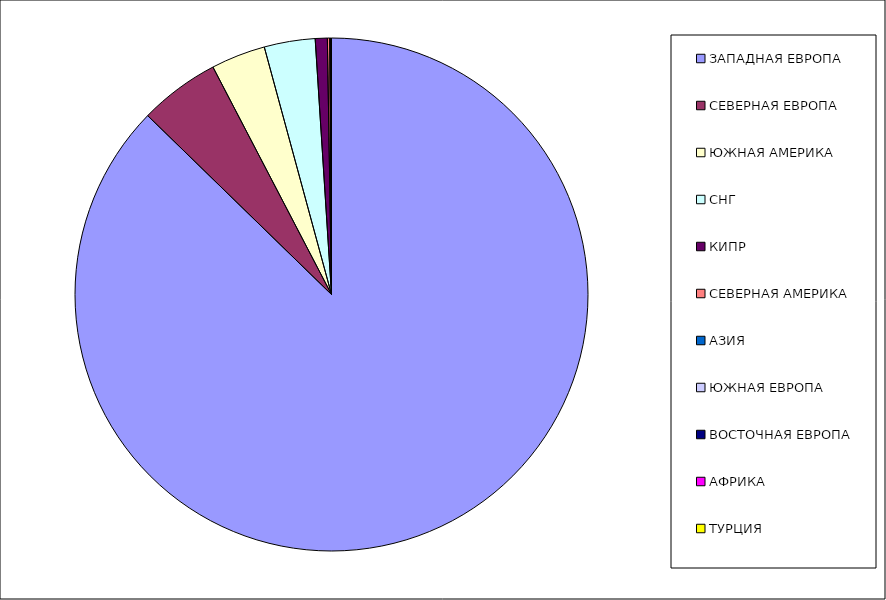
| Category | Оборот |
|---|---|
| ЗАПАДНАЯ ЕВРОПА | 0.873 |
| СЕВЕРНАЯ ЕВРОПА | 0.051 |
| ЮЖНАЯ АМЕРИКА | 0.034 |
| СНГ | 0.032 |
| КИПР | 0.008 |
| СЕВЕРНАЯ АМЕРИКА | 0.001 |
| АЗИЯ | 0.001 |
| ЮЖНАЯ ЕВРОПА | 0 |
| ВОСТОЧНАЯ ЕВРОПА | 0 |
| АФРИКА | 0 |
| ТУРЦИЯ | 0 |